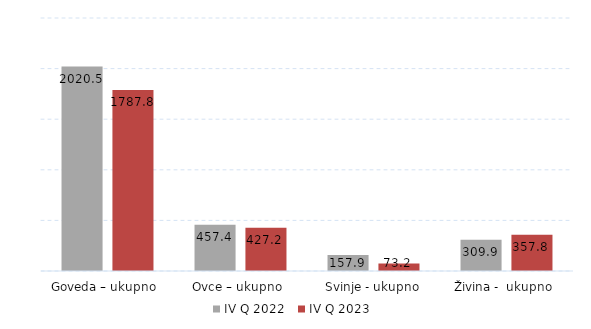
| Category | IV Q 2022 | IV Q 2023 |
|---|---|---|
| Goveda – ukupno  | 2020.5 | 1787.8 |
| Ovce – ukupno  | 457.4 | 427.2 |
| Svinje - ukupno | 157.9 | 73.2 |
| Živina -  ukupno  | 309.9 | 357.8 |